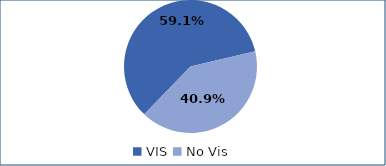
| Category | Series 0 |
|---|---|
| VIS | 0.591 |
| No Vis | 0.409 |